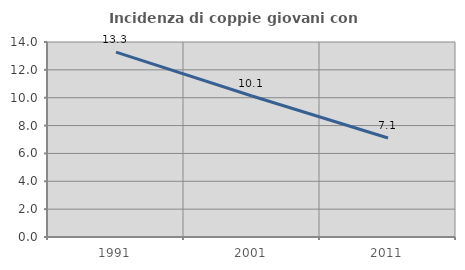
| Category | Incidenza di coppie giovani con figli |
|---|---|
| 1991.0 | 13.272 |
| 2001.0 | 10.123 |
| 2011.0 | 7.104 |